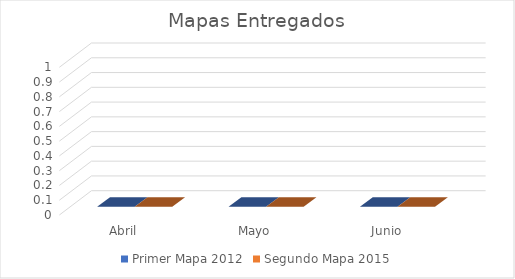
| Category | Primer Mapa 2012 | Segundo Mapa 2015 |
|---|---|---|
| Abril | 0 | 0 |
| Mayo | 0 | 0 |
| Junio | 0 | 0 |